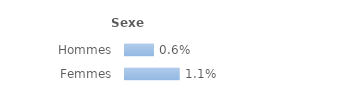
| Category | Series 0 |
|---|---|
| Hommes | 0.006 |
| Femmes | 0.011 |